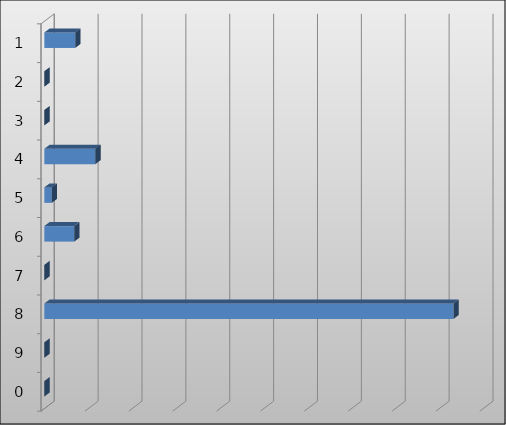
| Category | Series 0 |
|---|---|
| 1.0 | 3517429 |
| 2.0 | 0 |
| 3.0 | 2000 |
| 4.0 | 5812136 |
| 5.0 | 843125 |
| 6.0 | 3412850 |
| 7.0 | 0 |
| 8.0 | 46612731 |
| 9.0 | 0 |
| 0.0 | 0 |